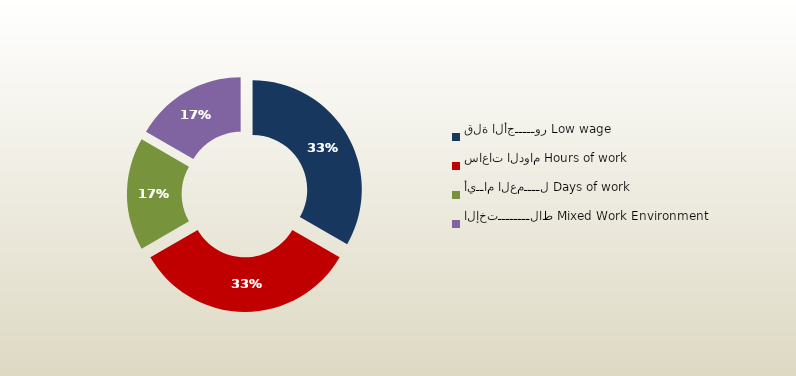
| Category | المجموع
Total |
|---|---|
| قلة الأجـــــور Low wage | 110 |
| ساعات الدوام Hours of work | 110 |
| أيــام العمــــل Days of work | 55 |
| الإختــــــــلاط Mixed Work Environment | 55 |